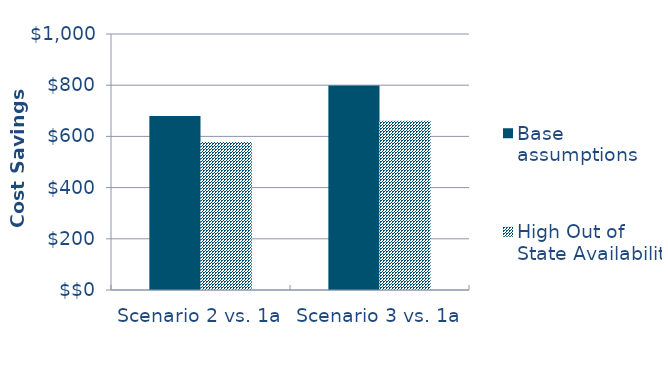
| Category | Base assumptions  | High Out of State Availability |
|---|---|---|
| Scenario 2 vs. 1a | -679.806 | -578.191 |
| Scenario 3 vs. 1a | -799.049 | -661.468 |